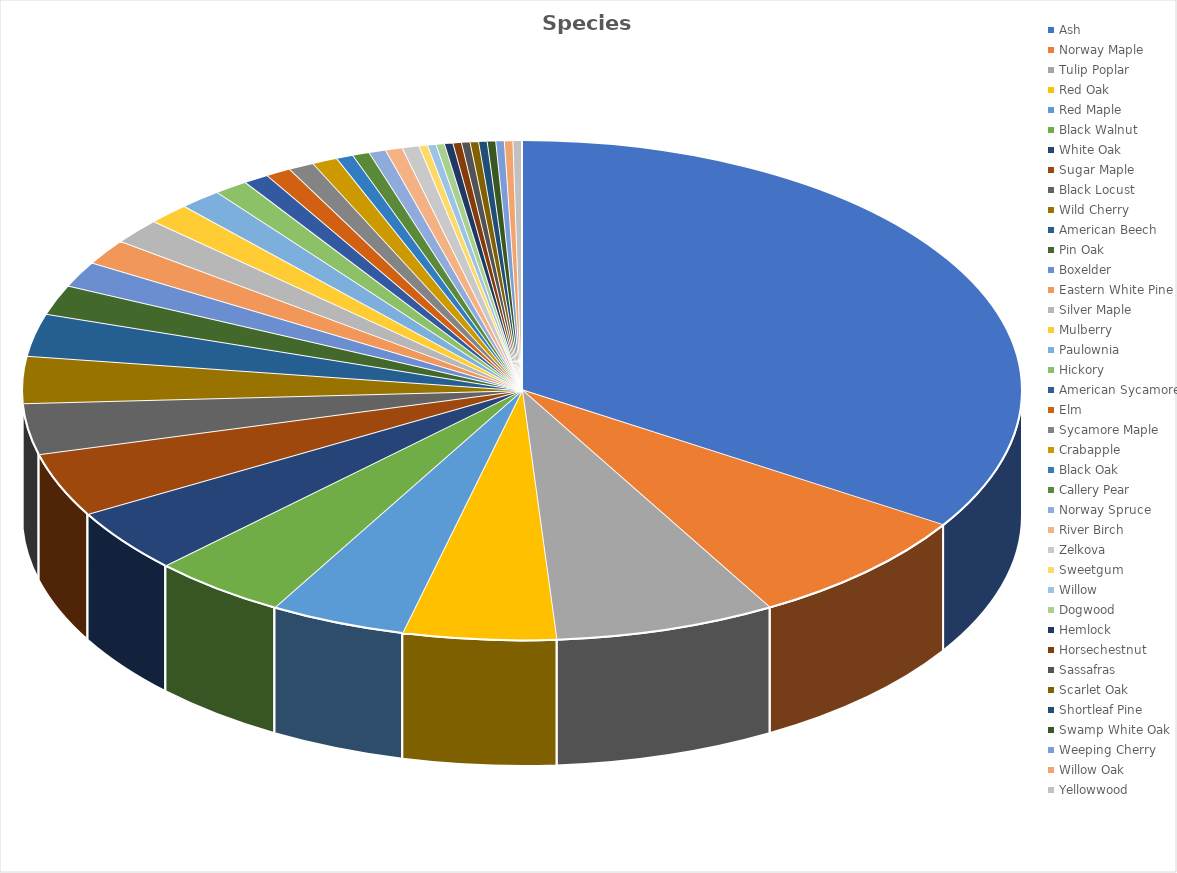
| Category | Series 0 |
|---|---|
| Ash | 0.341 |
| Norway Maple | 0.077 |
| Tulip Poplar | 0.071 |
| Red Oak | 0.049 |
| Red Maple | 0.044 |
| Black Walnut | 0.044 |
| White Oak | 0.041 |
| Sugar Maple | 0.041 |
| Black Locust | 0.033 |
| Wild Cherry | 0.03 |
| American Beech | 0.027 |
| Pin Oak | 0.019 |
| Boxelder | 0.016 |
| Eastern White Pine | 0.016 |
| Silver Maple | 0.016 |
| Mulberry | 0.014 |
| Paulownia | 0.014 |
| Hickory | 0.011 |
| American Sycamore | 0.008 |
| Elm | 0.008 |
| Sycamore Maple | 0.008 |
| Crabapple | 0.008 |
| Black Oak | 0.005 |
| Callery Pear | 0.005 |
| Norway Spruce | 0.005 |
| River Birch | 0.005 |
| Zelkova | 0.005 |
| Sweetgum | 0.003 |
| Willow | 0.003 |
| Dogwood | 0.003 |
| Hemlock | 0.003 |
| Horsechestnut | 0.003 |
| Sassafras | 0.003 |
| Scarlet Oak | 0.003 |
| Shortleaf Pine | 0.003 |
| Swamp White Oak | 0.003 |
| Weeping Cherry | 0.003 |
| Willow Oak | 0.003 |
| Yellowwood | 0.003 |